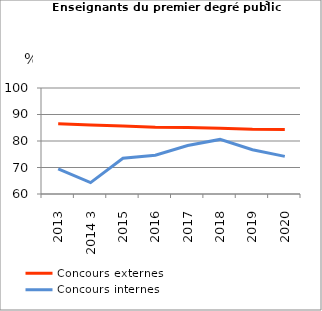
| Category | Concours externes  | Concours internes |
|---|---|---|
| 2013 | 86.5 | 69.5 |
| 2014 3 | 86 | 64.3 |
| 2015 | 85.7 | 73.5 |
| 2016 | 85.2 | 74.6 |
| 2017 | 85.1 | 78.3 |
| 2018 | 84.8 | 80.6 |
| 2019 | 84.4 | 76.7 |
| 2020 | 84.3 | 74.2 |